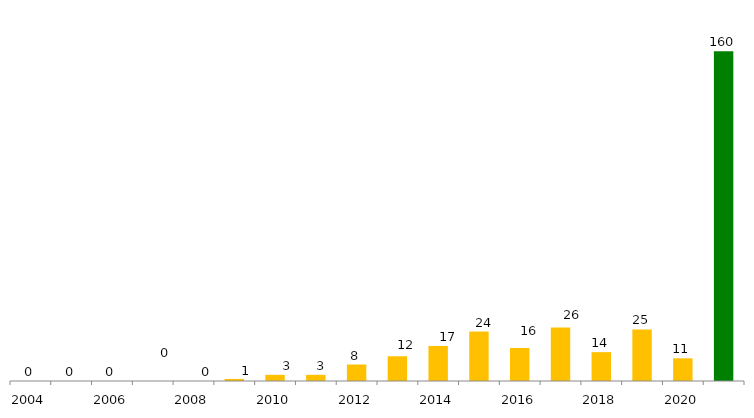
| Category | Categoria/Ano |
|---|---|
| 2004 | 0 |
| 2005 | 0 |
| 2006 | 0 |
| 2007 | 0 |
| 2008 | 0 |
| 2009 | 1 |
| 2010 | 3 |
| 2011 | 3 |
| 2012 | 8 |
| 2013 | 12 |
| 2014 | 17 |
| 2015 | 24 |
| 2016 | 16 |
| 2017 | 26 |
| 2018 | 14 |
| 2019 | 25 |
| 2020 | 11 |
| Total Geral | 160 |